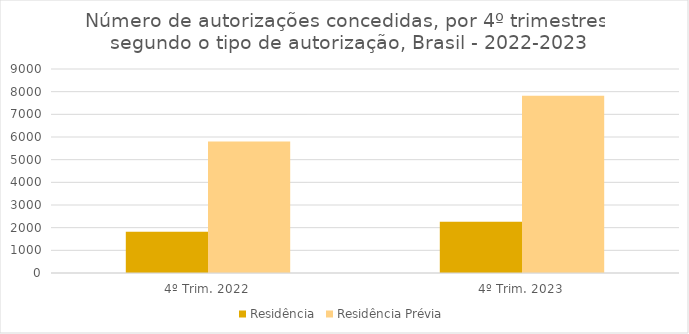
| Category | Residência | Residência Prévia |
|---|---|---|
| 4º Trim. 2022 | 1822 | 5796 |
| 4º Trim. 2023 | 2257 | 7815 |